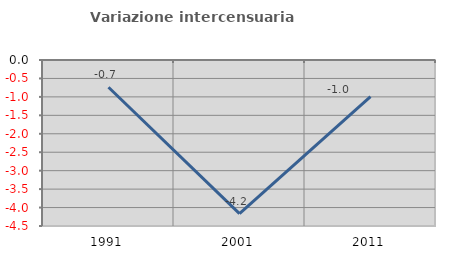
| Category | Variazione intercensuaria annua |
|---|---|
| 1991.0 | -0.74 |
| 2001.0 | -4.166 |
| 2011.0 | -0.991 |